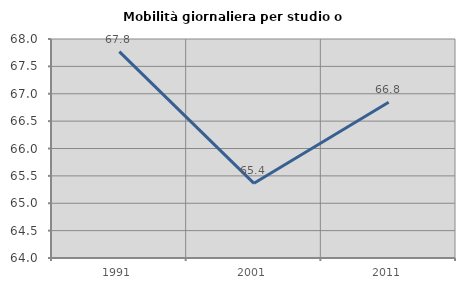
| Category | Mobilità giornaliera per studio o lavoro |
|---|---|
| 1991.0 | 67.77 |
| 2001.0 | 65.364 |
| 2011.0 | 66.845 |